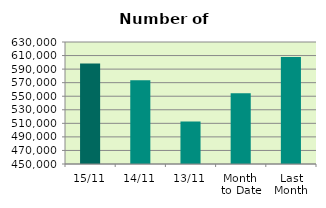
| Category | Series 0 |
|---|---|
| 15/11 | 598408 |
| 14/11 | 573424 |
| 13/11 | 512594 |
| Month 
to Date | 554422.364 |
| Last
Month | 607838.609 |